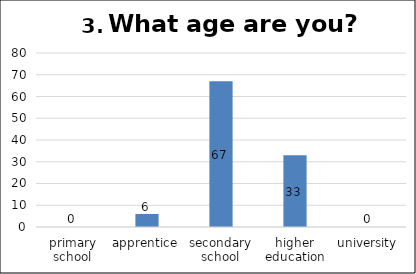
| Category | Series 0 |
|---|---|
| primary school | 0 |
| apprentice | 6 |
| secondary school | 67 |
| higher education | 33 |
| university | 0 |